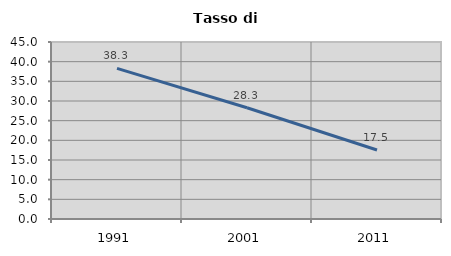
| Category | Tasso di disoccupazione   |
|---|---|
| 1991.0 | 38.292 |
| 2001.0 | 28.272 |
| 2011.0 | 17.541 |